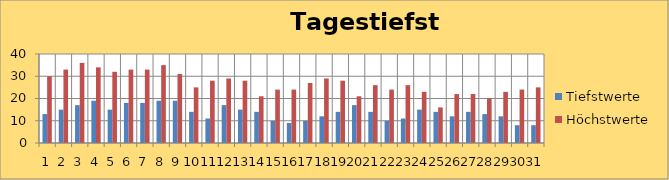
| Category | Tiefstwerte | Höchstwerte |
|---|---|---|
| 0 | 13 | 30 |
| 1 | 15 | 33 |
| 2 | 17 | 36 |
| 3 | 19 | 34 |
| 4 | 15 | 32 |
| 5 | 18 | 33 |
| 6 | 18 | 33 |
| 7 | 19 | 35 |
| 8 | 19 | 31 |
| 9 | 14 | 25 |
| 10 | 11 | 28 |
| 11 | 17 | 29 |
| 12 | 15 | 28 |
| 13 | 14 | 21 |
| 14 | 10 | 24 |
| 15 | 9 | 24 |
| 16 | 10 | 27 |
| 17 | 12 | 29 |
| 18 | 14 | 28 |
| 19 | 17 | 21 |
| 20 | 14 | 26 |
| 21 | 10 | 24 |
| 22 | 11 | 26 |
| 23 | 15 | 23 |
| 24 | 14 | 16 |
| 25 | 12 | 22 |
| 26 | 14 | 22 |
| 27 | 13 | 20 |
| 28 | 12 | 23 |
| 29 | 8 | 24 |
| 30 | 8 | 25 |